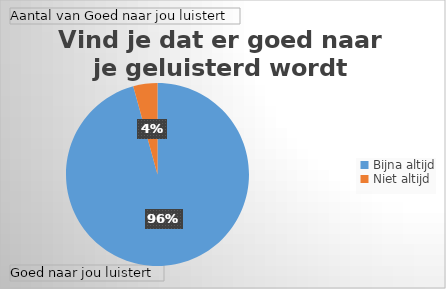
| Category | Totaal |
|---|---|
| Bijna altijd | 112 |
| Niet altijd | 5 |